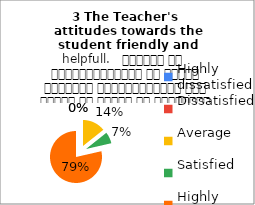
| Category | 3 The Teacher's 
attitudes towards the student friendly and helpfull.   शिक्षक का विद्यार्थियों के प्रति व्यवहार मित्रतापूर्ण एवम सहयोग के भावना से परिपूर्ण था |
|---|---|
| Highly dissatisfied | 0 |
| Dissatisfied | 0 |
| Average | 2 |
| Satisfied | 1 |
| Highly satisfied | 11 |